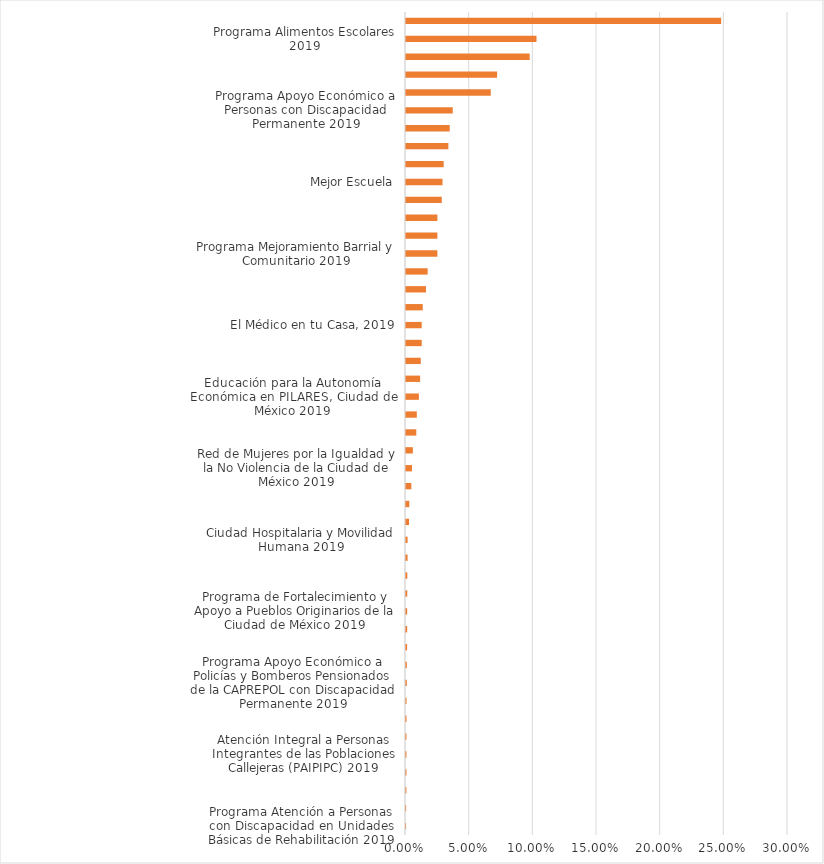
| Category | Series 0 | Series 1 |
|---|---|---|
| Programa Atención a Personas con Discapacidad en Unidades Básicas de Rehabilitación 2019 |  | 0 |
| Atención Prioritaria a personas egresadas del Sistema de Justicia Penal 2019 |  | 0 |
| Programa para el Fortalecimiento de la Autonomía y Empoderamiento Económico de las Mujeres de Comunidades y Pueblos Indígenas de la Ciudad de México 2019 |  | 0 |
| Apoyo para el Impulso Laboral de personas egresadas del Sistema de Justicia Penal de la Ciudad de México 2019 |  | 0 |
| Atención Integral a Personas Integrantes de las Poblaciones Callejeras (PAIPIPC) 2019 |  | 0 |
| Programa Hijas e Hijos de la Ciudad 2019 |  | 0 |
| Estímulos Económicos a Deportistas Destacados Representativos de la Ciudad de México, para el Ejercicio 2019 |  | 0 |
| Estímulos Económicos a las Asociaciones Deportivas de la Ciudad de México, que participan en la Olimpiada, Paralimpiada y Nacional Juvenil, para el Ejercicio 2019 |  | 0 |
| Programa Apoyo Económico a Policías y Bomberos Pensionados de la CAPREPOL con Discapacidad Permanente 2019 |  | 0.001 |
| Apoyo para Personas de Escasos Recursos que requieren Material de Osteosíntesis, Órtesis y Prótesis |  | 0.001 |
| Coinversión para Igualdad de la Ciudad de México |  | 0.001 |
| Programa de Fortalecimiento y Apoyo a las Comunidades Indígenas 2019 |  | 0.001 |
| Programa de Fortalecimiento y Apoyo a Pueblos Originarios de la Ciudad de México 2019 |  | 0.001 |
| Coinversión para la Inclusión y el Bienestar Social (COINBIS) 2019 |  | 0.001 |
| Programa Apoyo a Madres Solas Residentes de la Ciudad de México (PAIMS) 2019 |  | 0.001 |
| Financiamiento para la Asistencia e Integración Social (PROFAIS) 2019 |  | 0.001 |
| Ciudad Hospitalaria y Movilidad Humana 2019 |  | 0.001 |
| Seguro para el Fortalecimiento de la Autonomía de las Mujeres en Situación de Violencia de Género |  | 0.002 |
| Programa de Aparatos Auditivos Gratuitos "Escucha CDMX" |  | 0.003 |
| Colectivos Culturales Comunitarios Ciudad de México 2019 |  | 0.004 |
| Red de Mujeres por la Igualdad y la No Violencia de la Ciudad de México 2019 |  | 0.005 |
| Fomento al Trabajo Digno, para el Ejercicio Fiscal 2019 |  | 0.005 |
| Promotores Culturales Ciudad de México 2019 |  | 0.008 |
| Programa de Becas, para el Ejercicio Fiscal 2019” |  | 0.009 |
| Educación para la Autonomía Económica en PILARES, Ciudad de México 2019 |  | 0.01 |
| Comedores Públicos de la Ciudad de México 2019 |  | 0.011 |
| Programa Educación Garantizada de la Ciudad de México 2019 |  | 0.012 |
| Programa Niñas y Niños Talento 2019 |  | 0.012 |
| El Médico en tu Casa, 2019 |  | 0.012 |
| Talleres de Artes y Oficios Comunitarios 2019 |  | 0.013 |
| Ponte Pila, Deporte Comunitario, para el Ejercicio 2019 |  | 0.016 |
| Ciberescuelas en PILARES, 2019 |  | 0.017 |
| Programa Mejoramiento Barrial y Comunitario 2019 |  | 0.025 |
| Fomento, Constitución y Fortalecimiento de las Empresas Sociales y Solidarias de la Ciudad de México” (FOCOFESS 2019) |  | 0.025 |
| Programa de Sistemas de Captación de Agua de Lluvia en Viviendas de la Ciudad de México |  | 0.025 |
| Programa Becas Escolares para Niñas y Niños en Condiciones de Vulnerabilidad Social (más becas, mejor educación) 2019 |  | 0.028 |
| Mejor Escuela |  | 0.029 |
| Rescate Innovador y Participativo en Unidades Habitacionales 2019 |  | 0.03 |
| Comedores Comunitarios de la Ciudad de México 2019 |  | 0.033 |
| Útiles Escolares Gratuitos 2019 |  | 0.034 |
| Programa Apoyo Económico a Personas con Discapacidad Permanente 2019 |  | 0.037 |
| Programa de Estímulos para el Bachillerato Universal, "Prepa Sí" |  | 0.067 |
| Seguro de Desempleo |  | 0.072 |
| Uniformes Escolares Gratuitos 2019 |  | 0.097 |
| Programa Alimentos Escolares 2019 |  | 0.102 |
| Pensión Alimentaria para Personas Adultas Mayores de 68 años, residentes en la Ciudad de México 2019 |  | 0.248 |